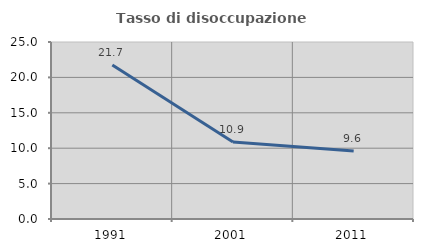
| Category | Tasso di disoccupazione giovanile  |
|---|---|
| 1991.0 | 21.739 |
| 2001.0 | 10.87 |
| 2011.0 | 9.615 |